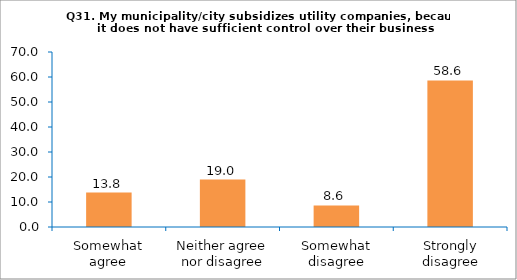
| Category | Series 0 |
|---|---|
| Somewhat agree | 13.793 |
| Neither agree nor disagree | 18.966 |
| Somewhat disagree | 8.621 |
| Strongly disagree | 58.621 |